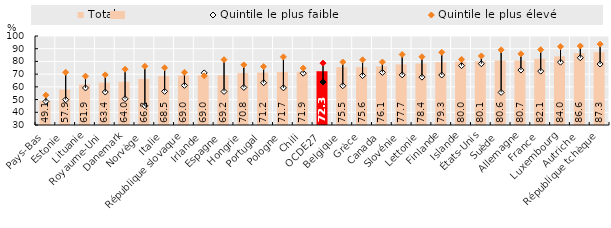
| Category | Total |
|---|---|
| Pays-Bas | 49.121 |
| Estonie | 57.885 |
| Lituanie | 61.87 |
| Royaume-Uni | 63.366 |
| Danemark | 63.99 |
| Norvège | 66.189 |
| Italie | 68.453 |
| République slovaque | 68.961 |
| Irlande | 68.988 |
| Espagne | 69.161 |
| Hongrie | 70.812 |
| Portugal | 71.236 |
| Pologne | 71.659 |
| Chili | 71.89 |
| OCDE27 | 72.285 |
| Belgique | 75.547 |
| Grèce | 75.565 |
| Canada | 76.127 |
| Slovénie | 77.658 |
| Lettonie | 78.354 |
| Finlande | 79.331 |
| Islande | 79.978 |
| États-Unis | 80.143 |
| Suède | 80.611 |
| Allemagne | 80.656 |
| France | 82.138 |
| Luxembourg | 84.015 |
| Autriche | 86.598 |
| République tchèque | 87.316 |